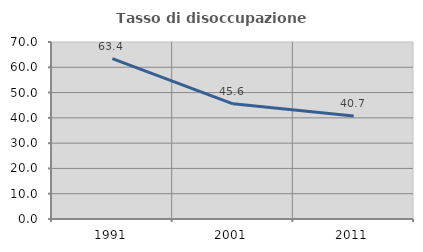
| Category | Tasso di disoccupazione giovanile  |
|---|---|
| 1991.0 | 63.393 |
| 2001.0 | 45.556 |
| 2011.0 | 40.741 |